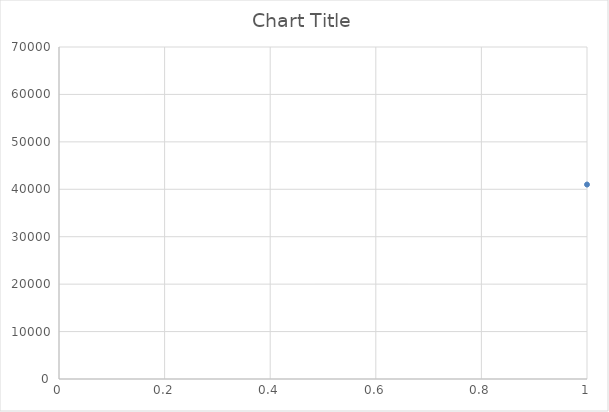
| Category | Series 0 |
|---|---|
| 0 | 41000 |
| 1 | 41500 |
| 2 | 41000 |
| 3 | 50500 |
| 4 | 31800 |
| 5 | 31400 |
| 6 | 31000 |
| 7 | 31800 |
| 8 | 42000 |
| 9 | 43500 |
| 10 | 31600 |
| 11 | 31600 |
| 12 | 31000 |
| 13 | 31600 |
| 14 | 31800 |
| 15 | 31400 |
| 16 | 31000 |
| 17 | 31800 |
| 18 | 42500 |
| 19 | 44500 |
| 20 | 42000 |
| 21 | 43500 |
| 22 | 9800 |
| 23 | 13000 |
| 24 | 19000 |
| 25 | 9000 |
| 26 | 12200 |
| 27 | 18000 |
| 28 | 24000 |
| 29 | 9800 |
| 30 | 9800 |
| 31 | 12000 |
| 32 | 18000 |
| 33 | 25000 |
| 34 | 23600 |
| 35 | 24000 |
| 36 | 23800 |
| 37 | 33400 |
| 38 | 35404 |
| 39 | 35738 |
| 40 | 33400 |
| 41 | 45500 |
| 42 | 46500 |
| 43 | 55500 |
| 44 | 19000 |
| 45 | 19000 |
| 46 | 48000 |
| 47 | 48000 |
| 48 | 23000 |
| 49 | 23000 |
| 50 | 28000 |
| 51 | 36000 |
| 52 | 36000 |
| 53 | 23600 |
| 54 | 24000 |
| 55 | 23800 |
| 56 | 33400 |
| 57 | 35404 |
| 58 | 35738 |
| 59 | 33400 |
| 60 | 45500 |
| 61 | 46500 |
| 62 | 55500 |
| 63 | 55500 |
| 64 | 33400 |
| 65 | 45500 |
| 66 | 23600 |
| 67 | 18000 |
| 68 | 18000 |
| 69 | 24000 |
| 70 | 11800 |
| 71 | 10900 |
| 72 | 18000 |
| 73 | 28000 |
| 74 | 9000 |
| 75 | 13000 |
| 76 | 19000 |
| 77 | 10900 |
| 78 | 11800 |
| 79 | 24000 |
| 80 | 18000 |
| 81 | 18900 |
| 82 | 24000 |
| 83 | 18940 |
| 84 | 24000 |
| 85 | 23600 |
| 86 | 35000 |
| 87 | 45500 |
| 88 | 50000 |
| 89 | 12000 |
| 90 | 16000 |
| 91 | 18000 |
| 92 | 12000 |
| 93 | 14400 |
| 94 | 18000 |
| 95 | 21600 |
| 96 | 25400 |
| 97 | 18295 |
| 98 | 18056 |
| 99 | 13679 |
| 100 | 10089 |
| 101 | 10942 |
| 102 | 10000 |
| 103 | 13500 |
| 104 | 16200 |
| 105 | 21600 |
| 106 | 11000 |
| 107 | 13000 |
| 108 | 8806.37 |
| 109 | 10900 |
| 110 | 11800 |
| 111 | 24000 |
| 112 | 24000 |
| 113 | 23250 |
| 114 | 10800 |
| 115 | 13300 |
| 116 | 27000 |
| 117 | 13600 |
| 118 | 22000 |
| 119 | 25000 |
| 120 | 36400 |
| 121 | 54000 |
| 122 | 42000 |
| 123 | 12000 |
| 124 | 16000 |
| 125 | 12000 |
| 126 | 12000 |
| 127 | 16000 |
| 128 | 16000 |
| 129 | 12000 |
| 130 | 16000 |
| 131 | 18000 |
| 132 | 12000 |
| 133 | 16000 |
| 134 | 18000 |
| 135 | 16000 |
| 136 | 18000 |
| 137 | 16000 |
| 138 | 18000 |
| 139 | 12000 |
| 140 | 12000 |
| 141 | 12000 |
| 142 | 12000 |
| 143 | 16000 |
| 144 | 16000 |
| 145 | 18000 |
| 146 | 18000 |
| 147 | 21600 |
| 148 | 21600 |
| 149 | 21850 |
| 150 | 22600 |
| 151 | 12000 |
| 152 | 16000 |
| 153 | 18000 |
| 154 | 21850 |
| 155 | 12000 |
| 156 | 10000 |
| 157 | 24400 |
| 158 | 19000 |
| 159 | 28000 |
| 160 | 48000 |
| 161 | 28000 |
| 162 | 36000 |
| 163 | 10000 |
| 164 | 12000 |
| 165 | 25000 |
| 166 | 12000 |
| 167 | 24000 |
| 168 | 11800 |
| 169 | 10900 |
| 170 | 10900 |
| 171 | 11800 |
| 172 | 24000 |
| 173 | 9800 |
| 174 | 18000 |
| 175 | 25000 |
| 176 | 10900 |
| 177 | 12000 |
| 178 | 24000 |
| 179 | 10000 |
| 180 | 12000 |
| 181 | 25000 |
| 182 | 12000 |
| 183 | 11000 |
| 184 | 12000 |
| 185 | 9800 |
| 186 | 9800 |
| 187 | 12000 |
| 188 | 12000 |
| 189 | 18000 |
| 190 | 18000 |
| 191 | 25000 |
| 192 | 25000 |
| 193 | 18000 |
| 194 | 24000 |
| 195 | 24000 |
| 196 | 10000 |
| 197 | 10000 |
| 198 | 12000 |
| 199 | 12000 |
| 200 | 18000 |
| 201 | 18000 |
| 202 | 24400 |
| 203 | 24400 |
| 204 | 9000 |
| 205 | 12200 |
| 206 | 18000 |
| 207 | 24000 |
| 208 | 29000 |
| 209 | 30000 |
| 210 | 42500 |
| 211 | 9000 |
| 212 | 13000 |
| 213 | 19000 |
| 214 | 18000 |
| 215 | 24000 |
| 216 | 9000 |
| 217 | 12200 |
| 218 | 9000 |
| 219 | 12600 |
| 220 | 16000 |
| 221 | 22000 |
| 222 | 27700 |
| 223 | 10000 |
| 224 | 12000 |
| 225 | 16500 |
| 226 | 20400 |
| 227 | 9000 |
| 228 | 9000 |
| 229 | 9000 |
| 230 | 9000 |
| 231 | 9000 |
| 232 | 9000 |
| 233 | 9000 |
| 234 | 13000 |
| 235 | 13000 |
| 236 | 13000 |
| 237 | 13000 |
| 238 | 13000 |
| 239 | 13000 |
| 240 | 13000 |
| 241 | 19000 |
| 242 | 19000 |
| 243 | 19000 |
| 244 | 19000 |
| 245 | 19000 |
| 246 | 19000 |
| 247 | 19000 |
| 248 | 33200 |
| 249 | 33000 |
| 250 | 28000 |
| 251 | 36000 |
| 252 | 10900 |
| 253 | 12000 |
| 254 | 24000 |
| 255 | 10900 |
| 256 | 12000 |
| 257 | 12000 |
| 258 | 24000 |
| 259 | 13600 |
| 260 | 22000 |
| 261 | 27000 |
| 262 | 24000 |
| 263 | 36000 |
| 264 | 23250 |
| 265 | 32000 |
| 266 | 54000 |
| 267 | 20000 |
| 268 | 27600 |
| 269 | 27000 |
| 270 | 10800 |
| 271 | 10800 |
| 272 | 13300 |
| 273 | 13300 |
| 274 | 12000 |
| 275 | 11000 |
| 276 | 22000 |
| 277 | 18000 |
| 278 | 48000 |
| 279 | 45000 |
| 280 | 45000 |
| 281 | 22000 |
| 282 | 42000 |
| 283 | 54000 |
| 284 | 66000 |
| 285 | 42000 |
| 286 | 66000 |
| 287 | 28600 |
| 288 | 25000 |
| 289 | 42000 |
| 290 | 28600 |
| 291 | 25000 |
| 292 | 13600 |
| 293 | 21600 |
| 294 | 38000 |
| 295 | 27600 |
| 296 | 10900 |
| 297 | 13600 |
| 298 | 10900 |
| 299 | 13600 |
| 300 | 18000 |
| 301 | 13600 |
| 302 | 10900 |
| 303 | 18540 |
| 304 | 10900 |
| 305 | 13600 |
| 306 | 10900 |
| 307 | 14400 |
| 308 | 18000 |
| 309 | 21600 |
| 310 | 26000 |
| 311 | 38000 |
| 312 | 20300 |
| 313 | 18000 |
| 314 | 8700 |
| 315 | 8700 |
| 316 | 20300 |
| 317 | 13000 |
| 318 | 11000 |
| 319 | 21000 |
| 320 | 21600 |
| 321 | 22400 |
| 322 | 34400 |
| 323 | 22400 |
| 324 | 34400 |
| 325 | 26000 |
| 326 | 12000 |
| 327 | 13800 |
| 328 | 21600 |
| 329 | 10900 |
| 330 | 13600 |
| 331 | 9000 |
| 332 | 11500 |
| 333 | 18000 |
| 334 | 28600 |
| 335 | 25000 |
| 336 | 22000 |
| 337 | 12000 |
| 338 | 32000 |
| 339 | 40000 |
| 340 | 12000 |
| 341 | 32000 |
| 342 | 40000 |
| 343 | 12600 |
| 344 | 13600 |
| 345 | 27000 |
| 346 | 12000 |
| 347 | 14000 |
| 348 | 11000 |
| 349 | 10800 |
| 350 | 18000 |
| 351 | 20200 |
| 352 | 20200 |
| 353 | 42500 |
| 354 | 32200 |
| 355 | 41000 |
| 356 | 20000 |
| 357 | 41500 |
| 358 | 32000 |
| 359 | 31800 |
| 360 | 31200 |
| 361 | 32600 |
| 362 | 32000 |
| 363 | 32000 |
| 364 | 31800 |
| 365 | 31200 |
| 366 | 32600 |
| 367 | 31600 |
| 368 | 31000 |
| 369 | 30400 |
| 370 | 30800 |
| 371 | 31800 |
| 372 | 43000 |
| 373 | 33800 |
| 374 | 32800 |
| 375 | 33200 |
| 376 | 33000 |
| 377 | 32800 |
| 378 | 33200 |
| 379 | 43500 |
| 380 | 20200 |